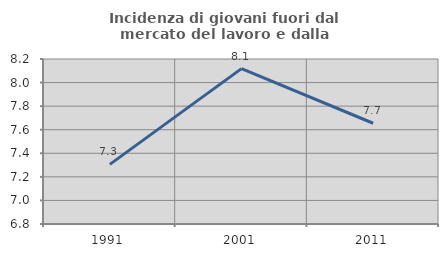
| Category | Incidenza di giovani fuori dal mercato del lavoro e dalla formazione  |
|---|---|
| 1991.0 | 7.306 |
| 2001.0 | 8.118 |
| 2011.0 | 7.655 |